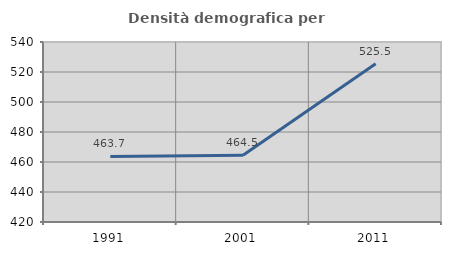
| Category | Densità demografica |
|---|---|
| 1991.0 | 463.713 |
| 2001.0 | 464.534 |
| 2011.0 | 525.469 |